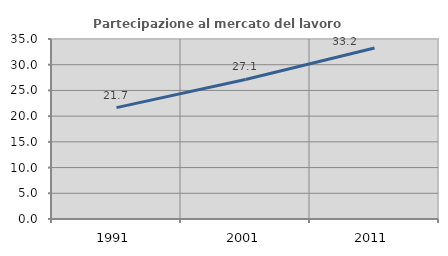
| Category | Partecipazione al mercato del lavoro  femminile |
|---|---|
| 1991.0 | 21.658 |
| 2001.0 | 27.136 |
| 2011.0 | 33.242 |